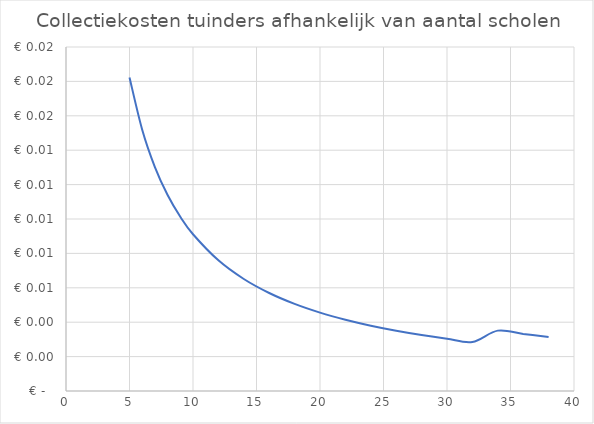
| Category | Series 0 |
|---|---|
| 5.0 | 0.018 |
| 6.0 | 0.015 |
| 7.0 | 0.013 |
| 8.0 | 0.011 |
| 9.0 | 0.01 |
| 10.0 | 0.009 |
| 12.0 | 0.008 |
| 14.0 | 0.007 |
| 16.0 | 0.006 |
| 18.0 | 0.005 |
| 20.0 | 0.005 |
| 22.0 | 0.004 |
| 24.0 | 0.004 |
| 26.0 | 0.004 |
| 28.0 | 0.003 |
| 30.0 | 0.003 |
| 32.0 | 0.003 |
| 34.0 | 0.004 |
| 36.0 | 0.003 |
| 38.0 | 0.003 |